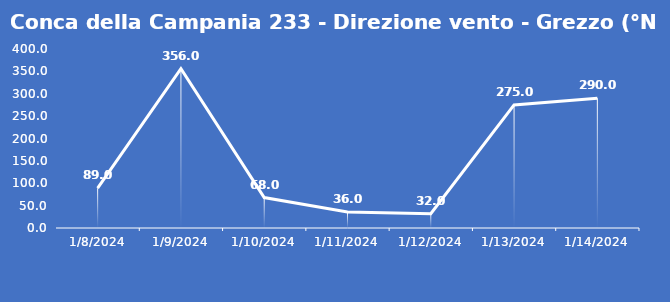
| Category | Conca della Campania 233 - Direzione vento - Grezzo (°N) |
|---|---|
| 1/8/24 | 89 |
| 1/9/24 | 356 |
| 1/10/24 | 68 |
| 1/11/24 | 36 |
| 1/12/24 | 32 |
| 1/13/24 | 275 |
| 1/14/24 | 290 |